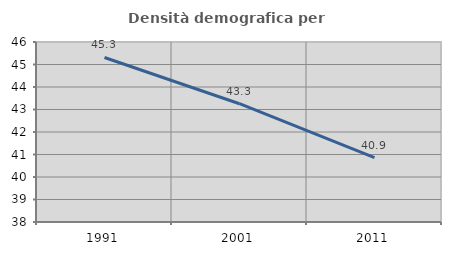
| Category | Densità demografica |
|---|---|
| 1991.0 | 45.312 |
| 2001.0 | 43.257 |
| 2011.0 | 40.857 |